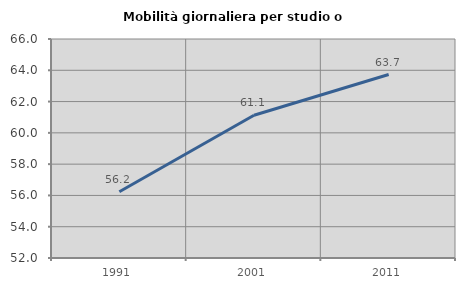
| Category | Mobilità giornaliera per studio o lavoro |
|---|---|
| 1991.0 | 56.235 |
| 2001.0 | 61.126 |
| 2011.0 | 63.728 |